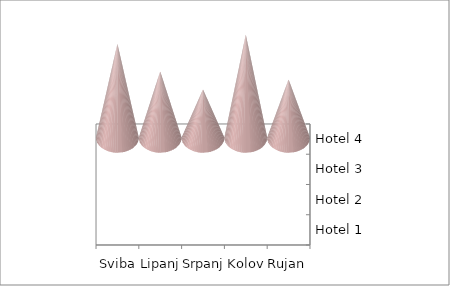
| Category | Hotel 1 | Hotel 2 | Hotel 3 | Hotel 4 |
|---|---|---|---|---|
| Svibanj | 47425 | 42284 | 15753 | 43772 |
| Lipanj | 32323 | 17255 | 43518 | 30913 |
| Srpanj | 27191 | 23828 | 47900 | 22470 |
| Kolovoz | 46488 | 35224 | 44021 | 48103 |
| Rujan | 20498 | 16513 | 17945 | 27132 |